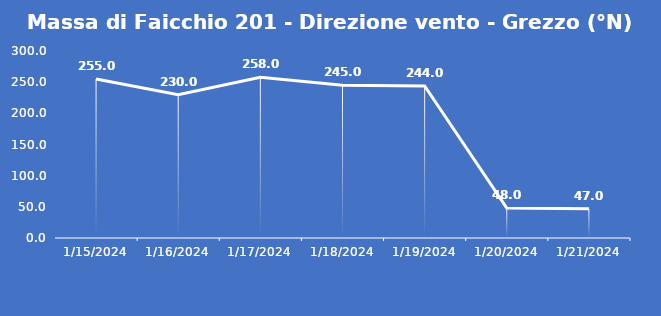
| Category | Massa di Faicchio 201 - Direzione vento - Grezzo (°N) |
|---|---|
| 1/15/24 | 255 |
| 1/16/24 | 230 |
| 1/17/24 | 258 |
| 1/18/24 | 245 |
| 1/19/24 | 244 |
| 1/20/24 | 48 |
| 1/21/24 | 47 |